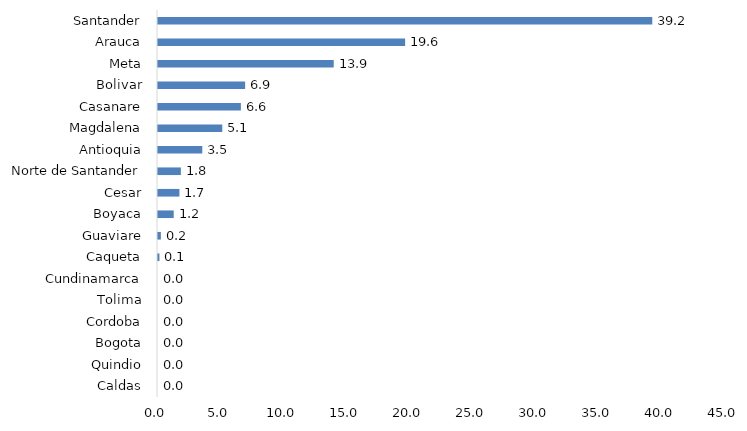
| Category | Series 0 |
|---|---|
| Caldas | 0 |
| Quindio | 0 |
| Bogota | 0 |
| Cordoba | 0 |
| Tolima | 0 |
| Cundinamarca | 0 |
| Caqueta | 0.113 |
| Guaviare | 0.227 |
| Boyaca | 1.247 |
| Cesar | 1.701 |
| Norte de Santander | 1.814 |
| Antioquia | 3.515 |
| Magdalena | 5.102 |
| Casanare | 6.576 |
| Bolivar | 6.916 |
| Meta | 13.946 |
| Arauca | 19.615 |
| Santander | 39.229 |